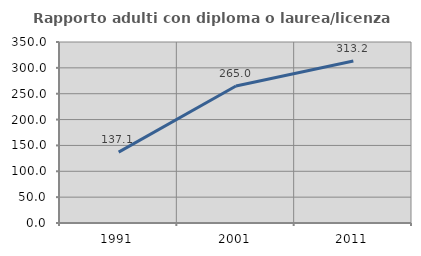
| Category | Rapporto adulti con diploma o laurea/licenza media  |
|---|---|
| 1991.0 | 137.097 |
| 2001.0 | 265 |
| 2011.0 | 313.235 |